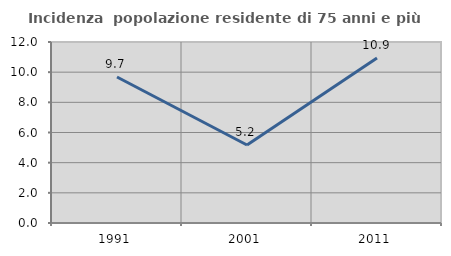
| Category | Incidenza  popolazione residente di 75 anni e più |
|---|---|
| 1991.0 | 9.677 |
| 2001.0 | 5.172 |
| 2011.0 | 10.945 |